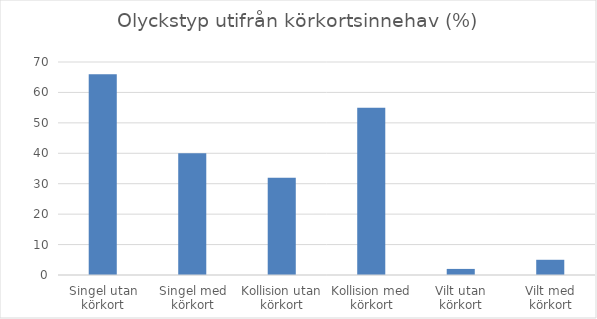
| Category | Andel (%) |
|---|---|
| Singel utan körkort | 66 |
| Singel med körkort | 40 |
| Kollision utan körkort | 32 |
| Kollision med körkort | 55 |
| Vilt utan körkort | 2 |
| Vilt med körkort | 5 |